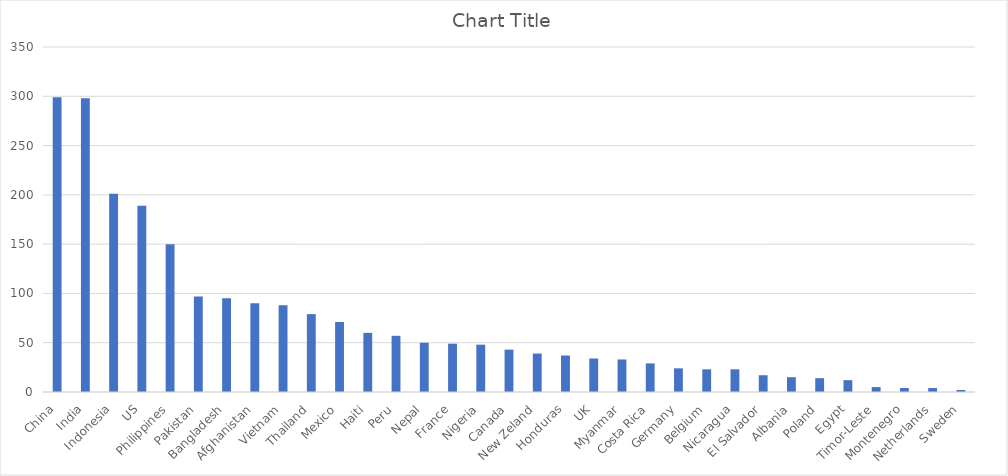
| Category | Series 0 |
|---|---|
| China | 299 |
| India | 298 |
| Indonesia | 201 |
| US | 189 |
| Philippines | 150 |
| Pakistan | 97 |
| Bangladesh | 95 |
| Afghanistan | 90 |
| Vietnam | 88 |
| Thailand | 79 |
| Mexico | 71 |
| Haiti | 60 |
| Peru | 57 |
| Nepal | 50 |
| France | 49 |
| Nigeria | 48 |
| Canada | 43 |
| New Zeland | 39 |
| Honduras | 37 |
| UK | 34 |
| Myanmar | 33 |
| Costa Rica | 29 |
| Germany | 24 |
| Belgium | 23 |
| Nicaragua | 23 |
| El Salvador | 17 |
| Albania | 15 |
| Poland | 14 |
| Egypt | 12 |
| Timor-Leste | 5 |
| Montenegro | 4 |
| Netherlands | 4 |
| Sweden | 2 |